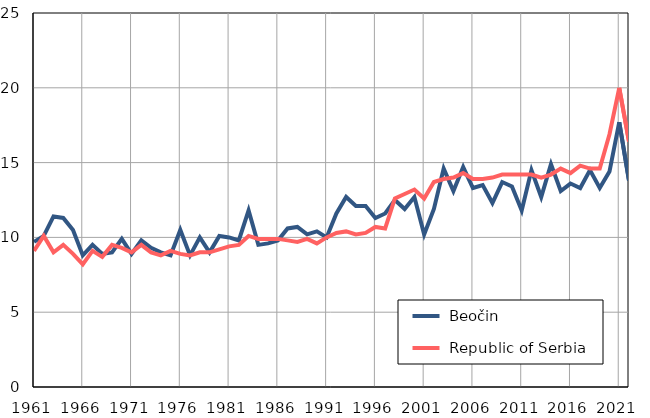
| Category |  Beočin |  Republic of Serbia |
|---|---|---|
| 1961.0 | 9.7 | 9.1 |
| 1962.0 | 10.1 | 10.1 |
| 1963.0 | 11.4 | 9 |
| 1964.0 | 11.3 | 9.5 |
| 1965.0 | 10.5 | 8.9 |
| 1966.0 | 8.8 | 8.2 |
| 1967.0 | 9.5 | 9.1 |
| 1968.0 | 8.9 | 8.7 |
| 1969.0 | 9 | 9.5 |
| 1970.0 | 9.9 | 9.3 |
| 1971.0 | 8.9 | 9 |
| 1972.0 | 9.8 | 9.5 |
| 1973.0 | 9.3 | 9 |
| 1974.0 | 9 | 8.8 |
| 1975.0 | 8.8 | 9.1 |
| 1976.0 | 10.5 | 8.9 |
| 1977.0 | 8.8 | 8.8 |
| 1978.0 | 10 | 9 |
| 1979.0 | 9 | 9 |
| 1980.0 | 10.1 | 9.2 |
| 1981.0 | 10 | 9.4 |
| 1982.0 | 9.8 | 9.5 |
| 1983.0 | 11.8 | 10.1 |
| 1984.0 | 9.5 | 9.9 |
| 1985.0 | 9.6 | 9.9 |
| 1986.0 | 9.8 | 9.9 |
| 1987.0 | 10.6 | 9.8 |
| 1988.0 | 10.7 | 9.7 |
| 1989.0 | 10.2 | 9.9 |
| 1990.0 | 10.4 | 9.6 |
| 1991.0 | 10 | 10 |
| 1992.0 | 11.6 | 10.3 |
| 1993.0 | 12.7 | 10.4 |
| 1994.0 | 12.1 | 10.2 |
| 1995.0 | 12.1 | 10.3 |
| 1996.0 | 11.3 | 10.7 |
| 1997.0 | 11.6 | 10.6 |
| 1998.0 | 12.5 | 12.6 |
| 1999.0 | 11.9 | 12.9 |
| 2000.0 | 12.7 | 13.2 |
| 2001.0 | 10.2 | 12.6 |
| 2002.0 | 11.9 | 13.7 |
| 2003.0 | 14.6 | 13.9 |
| 2004.0 | 13.1 | 14 |
| 2005.0 | 14.7 | 14.3 |
| 2006.0 | 13.3 | 13.9 |
| 2007.0 | 13.5 | 13.9 |
| 2008.0 | 12.3 | 14 |
| 2009.0 | 13.7 | 14.2 |
| 2010.0 | 13.4 | 14.2 |
| 2011.0 | 11.8 | 14.2 |
| 2012.0 | 14.5 | 14.2 |
| 2013.0 | 12.7 | 14 |
| 2014.0 | 14.9 | 14.2 |
| 2015.0 | 13.1 | 14.6 |
| 2016.0 | 13.6 | 14.3 |
| 2017.0 | 13.3 | 14.8 |
| 2018.0 | 14.5 | 14.6 |
| 2019.0 | 13.3 | 14.6 |
| 2020.0 | 14.4 | 16.9 |
| 2021.0 | 17.7 | 20 |
| 2022.0 | 13.8 | 16.4 |